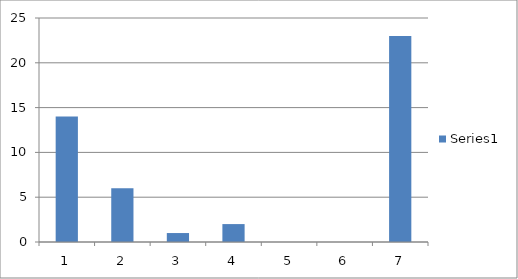
| Category | Series 0 |
|---|---|
| 0 | 14 |
| 1 | 6 |
| 2 | 1 |
| 3 | 2 |
| 4 | 0 |
| 5 | 0 |
| 6 | 23 |